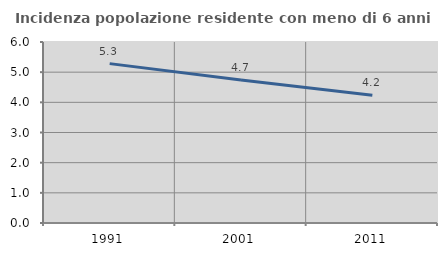
| Category | Incidenza popolazione residente con meno di 6 anni |
|---|---|
| 1991.0 | 5.283 |
| 2001.0 | 4.737 |
| 2011.0 | 4.235 |